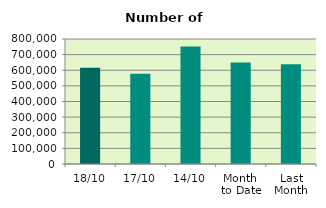
| Category | Series 0 |
|---|---|
| 18/10 | 616172 |
| 17/10 | 577410 |
| 14/10 | 752146 |
| Month 
to Date | 649610.333 |
| Last
Month | 637968.273 |